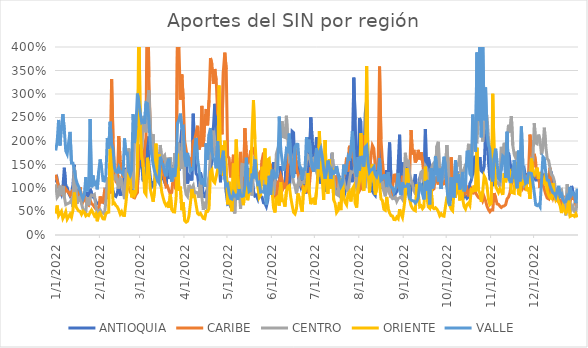
| Category | ANTIOQUIA | CARIBE | CENTRO | ORIENTE | VALLE |
|---|---|---|---|---|---|
| 1/1/22 | 1.117 | 1.285 | 1.082 | 0.455 | 1.798 |
| 1/2/22 | 1.192 | 1.158 | 0.803 | 0.627 | 1.982 |
| 1/3/22 | 1.023 | 1.024 | 0.848 | 0.408 | 2.448 |
| 1/4/22 | 0.936 | 0.945 | 1.053 | 0.456 | 1.904 |
| 1/5/22 | 0.863 | 0.889 | 0.849 | 0.505 | 2.307 |
| 1/6/22 | 1.01 | 0.976 | 1.039 | 0.351 | 2.572 |
| 1/7/22 | 1.431 | 0.874 | 0.812 | 0.409 | 2.235 |
| 1/8/22 | 1.046 | 0.979 | 0.646 | 0.493 | 1.79 |
| 1/9/22 | 1.014 | 0.939 | 0.664 | 0.336 | 1.722 |
| 1/10/22 | 0.889 | 0.909 | 0.679 | 0.39 | 1.964 |
| 1/11/22 | 0.828 | 0.85 | 0.693 | 0.445 | 2.193 |
| 1/12/22 | 0.887 | 0.909 | 0.748 | 0.377 | 1.531 |
| 1/13/22 | 1.061 | 0.841 | 0.593 | 0.521 | 1.53 |
| 1/14/22 | 1.492 | 0.789 | 1.447 | 0.903 | 1.378 |
| 1/15/22 | 0.922 | 0.735 | 1.1 | 0.612 | 1.202 |
| 1/16/22 | 0.868 | 0.699 | 0.672 | 0.556 | 1.094 |
| 1/17/22 | 0.958 | 0.734 | 0.785 | 0.511 | 1.031 |
| 1/18/22 | 0.845 | 1.02 | 0.81 | 0.502 | 0.942 |
| 1/19/22 | 0.805 | 0.789 | 0.665 | 0.441 | 0.848 |
| 1/20/22 | 0.802 | 0.719 | 0.553 | 0.508 | 0.769 |
| 1/21/22 | 0.793 | 0.817 | 0.512 | 0.485 | 0.862 |
| 1/22/22 | 0.901 | 0.718 | 0.499 | 0.407 | 1.234 |
| 1/23/22 | 0.886 | 0.656 | 0.804 | 0.433 | 0.93 |
| 1/24/22 | 0.786 | 0.635 | 0.634 | 0.416 | 1.03 |
| 1/25/22 | 0.984 | 0.742 | 0.781 | 0.478 | 2.469 |
| 1/26/22 | 0.893 | 0.666 | 0.85 | 0.531 | 1.016 |
| 1/27/22 | 0.808 | 0.643 | 0.84 | 0.474 | 1.266 |
| 1/28/22 | 0.794 | 0.592 | 0.862 | 0.409 | 1.081 |
| 1/29/22 | 0.714 | 0.556 | 0.614 | 0.449 | 1.115 |
| 1/30/22 | 0.663 | 0.572 | 0.483 | 0.292 | 0.971 |
| 1/31/22 | 0.661 | 0.528 | 0.506 | 0.444 | 1.353 |
| 2/1/22 | 0.716 | 0.821 | 0.538 | 0.476 | 1.607 |
| 2/2/22 | 0.737 | 0.698 | 0.487 | 0.405 | 1.429 |
| 2/3/22 | 0.706 | 0.697 | 0.474 | 0.344 | 1.159 |
| 2/4/22 | 0.844 | 0.921 | 0.447 | 0.34 | 1.15 |
| 2/5/22 | 0.987 | 0.862 | 0.701 | 0.451 | 1.269 |
| 2/6/22 | 0.991 | 0.764 | 1.226 | 0.482 | 2.063 |
| 2/7/22 | 1.141 | 0.968 | 1.022 | 0.487 | 1.84 |
| 2/8/22 | 1.17 | 0.885 | 1.08 | 2.15 | 2.41 |
| 2/9/22 | 1.132 | 3.317 | 1.543 | 1.607 | 1.933 |
| 2/10/22 | 0.936 | 2.051 | 1.194 | 0.667 | 1.834 |
| 2/11/22 | 0.842 | 1.395 | 1.194 | 0.681 | 1.437 |
| 2/12/22 | 0.82 | 1.136 | 1.263 | 0.627 | 1.347 |
| 2/13/22 | 0.887 | 1.101 | 1.109 | 0.597 | 1.333 |
| 2/14/22 | 1.111 | 2.107 | 0.987 | 0.531 | 1.433 |
| 2/15/22 | 0.862 | 1.571 | 1.208 | 0.445 | 1.335 |
| 2/16/22 | 0.864 | 1.37 | 1.163 | 0.497 | 1.34 |
| 2/17/22 | 0.915 | 1.222 | 0.95 | 0.418 | 1.293 |
| 2/18/22 | 1.428 | 1.377 | 0.763 | 0.417 | 2.054 |
| 2/19/22 | 1.14 | 1.198 | 1.375 | 0.689 | 1.731 |
| 2/20/22 | 1.352 | 1.054 | 1.377 | 0.995 | 1.739 |
| 2/21/22 | 1.532 | 1.016 | 1.844 | 1.328 | 1.36 |
| 2/22/22 | 1.308 | 0.922 | 1.54 | 1.179 | 1.281 |
| 2/23/22 | 1.006 | 0.865 | 1.488 | 0.799 | 1.381 |
| 2/24/22 | 0.896 | 0.805 | 0.991 | 0.947 | 2.569 |
| 2/25/22 | 0.853 | 0.791 | 2.285 | 0.849 | 1.956 |
| 2/26/22 | 0.96 | 0.855 | 2.519 | 0.917 | 2.323 |
| 2/27/22 | 1.066 | 0.901 | 2.3 | 1.433 | 3.009 |
| 2/28/22 | 1.38 | 1.923 | 3.345 | 4.696 | 2.828 |
| 3/1/22 | 1.515 | 1.605 | 2.213 | 2.29 | 2.602 |
| 3/2/22 | 1.741 | 1.79 | 1.824 | 1.668 | 2.4 |
| 3/3/22 | 1.166 | 1.455 | 2.522 | 1.498 | 2.433 |
| 3/4/22 | 1.164 | 1.835 | 2.378 | 0.91 | 2.365 |
| 3/5/22 | 1.311 | 2.073 | 2.184 | 0.862 | 2.812 |
| 3/6/22 | 2.095 | 5.801 | 2.824 | 1.644 | 2.798 |
| 3/7/22 | 1.518 | 3.355 | 3.08 | 1.416 | 2.45 |
| 3/8/22 | 1.23 | 2.271 | 2.322 | 0.978 | 1.931 |
| 3/9/22 | 1.031 | 1.823 | 1.841 | 0.843 | 1.696 |
| 3/10/22 | 1.096 | 1.861 | 2.141 | 0.709 | 1.502 |
| 3/11/22 | 1.023 | 1.517 | 1.361 | 0.952 | 1.357 |
| 3/12/22 | 1.525 | 1.32 | 1.336 | 1.944 | 1.255 |
| 3/13/22 | 1.154 | 1.289 | 1.648 | 1.176 | 1.161 |
| 3/14/22 | 1.377 | 1.298 | 1.597 | 1.72 | 1.112 |
| 3/15/22 | 1.306 | 1.116 | 1.915 | 1.166 | 1.664 |
| 3/16/22 | 1.2 | 1.46 | 1.593 | 0.914 | 1.536 |
| 3/17/22 | 1.222 | 1.617 | 1.661 | 0.79 | 1.489 |
| 3/18/22 | 1.123 | 1.176 | 1.696 | 0.686 | 1.333 |
| 3/19/22 | 1.053 | 1.026 | 1.451 | 0.629 | 1.249 |
| 3/20/22 | 1.388 | 1.042 | 1.643 | 0.667 | 1.541 |
| 3/21/22 | 1.194 | 0.948 | 1.491 | 0.576 | 1.624 |
| 3/22/22 | 1.373 | 0.871 | 1.655 | 0.873 | 1.27 |
| 3/23/22 | 1.485 | 0.906 | 1.147 | 0.541 | 1.136 |
| 3/24/22 | 1.244 | 1.245 | 1.215 | 0.494 | 1.422 |
| 3/25/22 | 1.254 | 1.063 | 1.744 | 0.49 | 1.236 |
| 3/26/22 | 1.395 | 0.972 | 1.296 | 0.776 | 1.505 |
| 3/27/22 | 1.74 | 4.322 | 1.957 | 1.728 | 2.375 |
| 3/28/22 | 1.372 | 3.986 | 1.938 | 0.941 | 2.45 |
| 3/29/22 | 1.929 | 2.88 | 1.472 | 1.029 | 2.582 |
| 3/30/22 | 2.246 | 3.417 | 1.408 | 0.528 | 2.274 |
| 3/31/22 | 1.939 | 2.891 | 2.229 | 0.694 | 2.302 |
| 4/1/22 | 1.88 | 2.001 | 1.047 | 0.305 | 1.627 |
| 4/2/22 | 1.733 | 1.815 | 0.865 | 0.272 | 1.457 |
| 4/3/22 | 1.093 | 1.585 | 0.822 | 0.292 | 1.747 |
| 4/4/22 | 1.265 | 1.647 | 1.066 | 0.401 | 1.554 |
| 4/5/22 | 1.233 | 1.618 | 0.958 | 0.669 | 1.364 |
| 4/6/22 | 1.16 | 1.452 | 0.996 | 0.979 | 1.399 |
| 4/7/22 | 2.579 | 2.001 | 1.052 | 0.819 | 1.404 |
| 4/8/22 | 1.662 | 2.033 | 0.884 | 0.826 | 1.858 |
| 4/9/22 | 1.303 | 2.178 | 0.909 | 0.636 | 2.065 |
| 4/10/22 | 1.266 | 2.325 | 0.898 | 0.463 | 1.615 |
| 4/11/22 | 1.024 | 1.819 | 0.791 | 0.433 | 1.401 |
| 4/12/22 | 1.333 | 1.914 | 1.159 | 0.46 | 1.176 |
| 4/13/22 | 1.173 | 2.748 | 0.813 | 0.408 | 1.076 |
| 4/14/22 | 0.821 | 1.882 | 0.535 | 0.354 | 1.21 |
| 4/15/22 | 0.814 | 2.393 | 0.646 | 0.345 | 1.025 |
| 4/16/22 | 0.909 | 2.682 | 0.594 | 0.501 | 1.949 |
| 4/17/22 | 0.994 | 2.334 | 1.033 | 0.499 | 1.602 |
| 4/18/22 | 1.198 | 2.871 | 1.238 | 0.559 | 2.136 |
| 4/19/22 | 1.384 | 3.765 | 1.737 | 1.344 | 2.277 |
| 4/20/22 | 1.579 | 3.639 | 2.136 | 1.388 | 1.764 |
| 4/21/22 | 2.253 | 3.218 | 2.22 | 1.148 | 1.636 |
| 4/22/22 | 2.792 | 3.533 | 1.743 | 1.111 | 1.571 |
| 4/23/22 | 2.499 | 3.292 | 1.666 | 1.246 | 1.419 |
| 4/24/22 | 1.585 | 2.586 | 1.498 | 1.394 | 1.996 |
| 4/25/22 | 1.539 | 2.471 | 2.193 | 3.183 | 1.479 |
| 4/26/22 | 1.122 | 2.632 | 1.747 | 1.304 | 1.292 |
| 4/27/22 | 1.686 | 2.144 | 1.682 | 1.907 | 1.604 |
| 4/28/22 | 1.359 | 3.487 | 1.832 | 1.267 | 1.793 |
| 4/29/22 | 1.699 | 3.878 | 1.627 | 2.006 | 1.184 |
| 4/30/22 | 0.909 | 3.529 | 1.34 | 1.371 | 1.05 |
| 5/1/22 | 0.661 | 1.679 | 0.957 | 0.651 | 1.078 |
| 5/2/22 | 0.683 | 1.636 | 0.786 | 1.134 | 0.886 |
| 5/3/22 | 0.603 | 1.226 | 0.681 | 0.663 | 0.779 |
| 5/4/22 | 0.563 | 1.428 | 0.594 | 0.504 | 0.764 |
| 5/5/22 | 0.813 | 1.709 | 0.626 | 1.519 | 0.888 |
| 5/6/22 | 0.872 | 1.39 | 0.459 | 0.885 | 0.83 |
| 5/7/22 | 1.434 | 1.254 | 1.152 | 2.03 | 0.845 |
| 5/8/22 | 1.149 | 1.049 | 1.131 | 1.274 | 0.745 |
| 5/9/22 | 0.983 | 1.344 | 0.967 | 0.997 | 0.976 |
| 5/10/22 | 1.09 | 1.767 | 0.554 | 0.82 | 0.839 |
| 5/11/22 | 1.02 | 1.114 | 1.502 | 0.904 | 0.82 |
| 5/12/22 | 0.964 | 0.957 | 1.495 | 0.636 | 0.832 |
| 5/13/22 | 0.867 | 2.272 | 1.245 | 0.947 | 1.038 |
| 5/14/22 | 1.212 | 1.766 | 1.523 | 0.985 | 1.644 |
| 5/15/22 | 0.961 | 1.517 | 1.049 | 0.739 | 1.201 |
| 5/16/22 | 1.423 | 1.593 | 1.035 | 0.946 | 0.922 |
| 5/17/22 | 0.934 | 1.782 | 1.422 | 1.201 | 0.943 |
| 5/18/22 | 1.208 | 1.803 | 0.84 | 2.149 | 1.308 |
| 5/19/22 | 0.936 | 1.832 | 1.382 | 2.873 | 1.204 |
| 5/20/22 | 0.831 | 1.691 | 1.679 | 2.042 | 1.604 |
| 5/21/22 | 0.848 | 1.382 | 1.347 | 1.476 | 1.232 |
| 5/22/22 | 0.77 | 1.229 | 1.045 | 1.053 | 1.085 |
| 5/23/22 | 0.937 | 1.292 | 0.976 | 0.799 | 1.116 |
| 5/24/22 | 0.82 | 1.127 | 1.051 | 0.851 | 0.913 |
| 5/25/22 | 0.806 | 1.587 | 1.178 | 1.452 | 0.919 |
| 5/26/22 | 0.686 | 1.751 | 1.046 | 1.18 | 0.911 |
| 5/27/22 | 0.674 | 1.506 | 1.414 | 1.841 | 1.068 |
| 5/28/22 | 0.604 | 1.559 | 1.085 | 1.024 | 0.646 |
| 5/29/22 | 0.736 | 1.575 | 0.944 | 1.603 | 0.886 |
| 5/30/22 | 1.114 | 1.376 | 0.921 | 1.627 | 1.26 |
| 5/31/22 | 1.027 | 1.433 | 0.917 | 1.194 | 0.859 |
| 6/1/22 | 1.03 | 1.043 | 1.002 | 0.935 | 1.366 |
| 6/2/22 | 1.553 | 1.032 | 0.847 | 0.58 | 1.366 |
| 6/3/22 | 1.268 | 0.857 | 1.142 | 0.48 | 1.215 |
| 6/4/22 | 0.958 | 0.744 | 1.727 | 0.787 | 1.225 |
| 6/5/22 | 1.008 | 1.129 | 1.836 | 0.815 | 1.453 |
| 6/6/22 | 1.144 | 1.141 | 1.738 | 0.626 | 2.519 |
| 6/7/22 | 1.468 | 1.268 | 2.26 | 1.121 | 1.836 |
| 6/8/22 | 1.008 | 1.171 | 2.42 | 0.726 | 1.59 |
| 6/9/22 | 1.009 | 1.006 | 2.088 | 0.724 | 1.361 |
| 6/10/22 | 1.039 | 1.067 | 2.075 | 0.604 | 1.537 |
| 6/11/22 | 1.732 | 1.008 | 2.538 | 0.933 | 1.828 |
| 6/12/22 | 1.222 | 1.467 | 2.024 | 1.024 | 1.794 |
| 6/13/22 | 0.957 | 1.86 | 1.606 | 1.049 | 2.158 |
| 6/14/22 | 1.498 | 1.618 | 1.654 | 0.806 | 1.68 |
| 6/15/22 | 2.204 | 1.521 | 1.29 | 0.634 | 1.293 |
| 6/16/22 | 2.176 | 1.577 | 1.115 | 0.482 | 1.216 |
| 6/17/22 | 1.303 | 1.838 | 1.037 | 0.449 | 1.875 |
| 6/18/22 | 1.434 | 1.419 | 0.878 | 0.559 | 1.93 |
| 6/19/22 | 1.579 | 1.312 | 1.082 | 0.882 | 1.928 |
| 6/20/22 | 1.127 | 1.188 | 1.183 | 0.795 | 1.497 |
| 6/21/22 | 1.026 | 1.06 | 1.075 | 0.62 | 1.428 |
| 6/22/22 | 1.155 | 1.012 | 1.116 | 0.493 | 1.178 |
| 6/23/22 | 1.155 | 0.946 | 1.114 | 0.993 | 1.403 |
| 6/24/22 | 0.878 | 1.064 | 1.305 | 0.942 | 1.397 |
| 6/25/22 | 1.104 | 0.951 | 1.59 | 1.032 | 2.083 |
| 6/26/22 | 2.074 | 0.919 | 1.692 | 1.315 | 1.759 |
| 6/27/22 | 1.332 | 1.05 | 1.658 | 0.914 | 2.027 |
| 6/28/22 | 2.501 | 1.407 | 1.527 | 0.655 | 1.684 |
| 6/29/22 | 2.024 | 1.396 | 1.608 | 0.76 | 1.426 |
| 6/30/22 | 1.66 | 1.52 | 1.632 | 0.77 | 1.346 |
| 7/1/22 | 1.686 | 1.372 | 1.495 | 0.646 | 1.549 |
| 7/2/22 | 2.084 | 1.777 | 1.341 | 0.929 | 1.851 |
| 7/3/22 | 1.169 | 1.271 | 1.238 | 1.274 | 1.402 |
| 7/4/22 | 1.4 | 1.936 | 1.801 | 2.211 | 1.762 |
| 7/5/22 | 1.094 | 1.583 | 1.856 | 1.387 | 1.84 |
| 7/6/22 | 1.199 | 1.333 | 1.516 | 1.18 | 1.674 |
| 7/7/22 | 1.081 | 1.219 | 1.595 | 0.747 | 1.401 |
| 7/8/22 | 1.279 | 1.317 | 1.167 | 2.02 | 1.198 |
| 7/9/22 | 0.916 | 1.4 | 1.443 | 1.119 | 1.381 |
| 7/10/22 | 1.079 | 1.358 | 1.248 | 0.877 | 1.585 |
| 7/11/22 | 1.52 | 1.236 | 1.129 | 1.612 | 1.422 |
| 7/12/22 | 1.032 | 1.513 | 1.236 | 0.99 | 1.193 |
| 7/13/22 | 1.735 | 1.446 | 1.753 | 1.422 | 1.372 |
| 7/14/22 | 1.089 | 1.248 | 1.218 | 0.746 | 1.314 |
| 7/15/22 | 0.894 | 1.242 | 0.958 | 0.672 | 1.331 |
| 7/16/22 | 0.989 | 1.009 | 0.863 | 0.476 | 1.468 |
| 7/17/22 | 1.298 | 1.214 | 0.845 | 0.521 | 1.299 |
| 7/18/22 | 1.237 | 1.148 | 1.238 | 0.703 | 1.148 |
| 7/19/22 | 0.803 | 0.969 | 0.826 | 0.53 | 1.034 |
| 7/20/22 | 0.763 | 1.08 | 1.128 | 1.211 | 1.093 |
| 7/21/22 | 0.8 | 1.226 | 1.18 | 0.812 | 1.499 |
| 7/22/22 | 0.925 | 1.403 | 1.033 | 0.694 | 1.293 |
| 7/23/22 | 1.398 | 1.646 | 0.996 | 0.642 | 1.448 |
| 7/24/22 | 0.995 | 1.353 | 0.92 | 0.874 | 1.655 |
| 7/25/22 | 1.382 | 1.897 | 1.17 | 0.92 | 1.581 |
| 7/26/22 | 1.574 | 1.641 | 1.349 | 0.713 | 1.834 |
| 7/27/22 | 1.125 | 1.813 | 1.334 | 0.976 | 2.205 |
| 7/28/22 | 3.347 | 1.622 | 1.348 | 1.036 | 1.776 |
| 7/29/22 | 2.449 | 1.265 | 1.454 | 0.674 | 1.382 |
| 7/30/22 | 1.188 | 1.048 | 0.994 | 0.584 | 1.242 |
| 7/31/22 | 1.15 | 1.049 | 1.024 | 0.997 | 1.655 |
| 8/1/22 | 2.49 | 0.942 | 1.274 | 1.141 | 1.372 |
| 8/2/22 | 2.398 | 0.991 | 1.313 | 2.167 | 1.681 |
| 8/3/22 | 1.447 | 1.463 | 1.209 | 1.237 | 1.601 |
| 8/4/22 | 1.489 | 2.127 | 1.066 | 0.936 | 1.455 |
| 8/5/22 | 2.584 | 1.535 | 1.004 | 1.398 | 1.872 |
| 8/6/22 | 2.872 | 1.447 | 1.797 | 3.597 | 1.902 |
| 8/7/22 | 1.359 | 1.462 | 1.406 | 1.313 | 1.544 |
| 8/8/22 | 1.104 | 1.38 | 1.203 | 0.904 | 1.336 |
| 8/9/22 | 1.173 | 1.676 | 1.13 | 1.41 | 1.383 |
| 8/10/22 | 0.933 | 1.906 | 1.444 | 1.502 | 1.395 |
| 8/11/22 | 0.882 | 1.844 | 1.512 | 1.17 | 1.442 |
| 8/12/22 | 0.844 | 1.463 | 0.988 | 0.858 | 1.289 |
| 8/13/22 | 1.133 | 1.412 | 1.034 | 0.978 | 1.243 |
| 8/14/22 | 1.594 | 1.409 | 1.132 | 1.351 | 1.349 |
| 8/15/22 | 1.936 | 3.583 | 1.135 | 1.074 | 1.633 |
| 8/16/22 | 1.867 | 2.042 | 1.052 | 0.769 | 1.163 |
| 8/17/22 | 1.002 | 1.569 | 1.148 | 0.734 | 1.194 |
| 8/18/22 | 0.974 | 1.252 | 0.934 | 0.549 | 1.264 |
| 8/19/22 | 0.888 | 1.039 | 0.822 | 0.527 | 1.265 |
| 8/20/22 | 1.38 | 0.949 | 0.997 | 0.81 | 1.02 |
| 8/21/22 | 1.106 | 0.988 | 1.169 | 0.561 | 1.335 |
| 8/22/22 | 1.966 | 0.898 | 0.89 | 0.469 | 1.101 |
| 8/23/22 | 1.164 | 0.8 | 0.817 | 0.412 | 1.032 |
| 8/24/22 | 0.846 | 0.982 | 0.776 | 0.405 | 1.006 |
| 8/25/22 | 0.8 | 1.273 | 0.792 | 0.33 | 0.902 |
| 8/26/22 | 0.872 | 1.278 | 0.811 | 0.326 | 0.974 |
| 8/27/22 | 0.927 | 1.047 | 0.715 | 0.381 | 1.064 |
| 8/28/22 | 1.515 | 1.019 | 0.778 | 0.346 | 1.32 |
| 8/29/22 | 2.134 | 1.006 | 0.792 | 0.549 | 0.944 |
| 8/30/22 | 0.9 | 0.987 | 0.811 | 0.442 | 0.848 |
| 8/31/22 | 1.544 | 1.261 | 0.759 | 0.371 | 1.124 |
| 9/1/22 | 1.086 | 1.012 | 1.123 | 0.575 | 1.029 |
| 9/2/22 | 0.91 | 0.942 | 1.749 | 0.825 | 1.039 |
| 9/3/22 | 1.57 | 1.257 | 1.457 | 1.421 | 1.038 |
| 9/4/22 | 0.93 | 1.3 | 1.599 | 1.243 | 1.107 |
| 9/5/22 | 0.747 | 1.255 | 1.306 | 0.764 | 0.782 |
| 9/6/22 | 1.006 | 2.233 | 1.175 | 0.626 | 0.745 |
| 9/7/22 | 1.158 | 1.714 | 1.092 | 0.567 | 0.727 |
| 9/8/22 | 1.024 | 1.811 | 0.949 | 0.532 | 0.725 |
| 9/9/22 | 1.289 | 1.543 | 0.878 | 0.517 | 0.68 |
| 9/10/22 | 0.811 | 1.622 | 0.865 | 1.08 | 0.718 |
| 9/11/22 | 0.762 | 1.811 | 1.108 | 0.899 | 0.783 |
| 9/12/22 | 1.208 | 1.607 | 1.126 | 0.601 | 1.091 |
| 9/13/22 | 1.312 | 1.761 | 1.339 | 0.623 | 1.072 |
| 9/14/22 | 1.358 | 1.553 | 1.361 | 0.56 | 0.87 |
| 9/15/22 | 0.924 | 1.303 | 1.118 | 0.6 | 0.757 |
| 9/16/22 | 2.254 | 1.421 | 1.467 | 1.454 | 1.15 |
| 9/17/22 | 1.038 | 1.269 | 1.415 | 0.825 | 0.939 |
| 9/18/22 | 1.653 | 1.291 | 1.204 | 0.602 | 1.172 |
| 9/19/22 | 1.491 | 1.261 | 1.105 | 0.571 | 0.652 |
| 9/20/22 | 1.178 | 1.024 | 1.39 | 0.991 | 1.42 |
| 9/21/22 | 1.278 | 0.96 | 1.496 | 0.583 | 0.99 |
| 9/22/22 | 1.5 | 0.985 | 1.535 | 0.559 | 1.121 |
| 9/23/22 | 1.402 | 1.242 | 1.347 | 0.581 | 1.679 |
| 9/24/22 | 1.634 | 1.153 | 1.894 | 0.551 | 1.41 |
| 9/25/22 | 1.566 | 1.074 | 1.984 | 0.497 | 1.139 |
| 9/26/22 | 1.289 | 1.456 | 1.256 | 0.41 | 1.412 |
| 9/27/22 | 1.045 | 0.991 | 1.315 | 0.453 | 0.978 |
| 9/28/22 | 1.244 | 1.249 | 1.166 | 0.408 | 1.428 |
| 9/29/22 | 1.242 | 1.091 | 1.495 | 0.4 | 1.666 |
| 9/30/22 | 1.379 | 1.102 | 1.424 | 0.606 | 1.462 |
| 10/1/22 | 1.125 | 1.045 | 1.912 | 0.804 | 1.02 |
| 10/2/22 | 0.794 | 1.039 | 1.445 | 0.857 | 0.699 |
| 10/3/22 | 0.748 | 0.864 | 0.903 | 0.639 | 0.621 |
| 10/4/22 | 0.758 | 1.652 | 0.932 | 0.548 | 1.229 |
| 10/5/22 | 0.942 | 1.065 | 0.822 | 0.515 | 0.953 |
| 10/6/22 | 0.955 | 0.871 | 0.992 | 0.947 | 0.794 |
| 10/7/22 | 1.023 | 1.348 | 1.14 | 0.794 | 1.592 |
| 10/8/22 | 1.356 | 0.971 | 1.456 | 1.304 | 1.116 |
| 10/9/22 | 1.059 | 0.896 | 1.5 | 1.034 | 1.289 |
| 10/10/22 | 0.94 | 0.848 | 1.695 | 0.734 | 0.968 |
| 10/11/22 | 0.892 | 0.774 | 1.194 | 1.127 | 1.091 |
| 10/12/22 | 0.753 | 1.151 | 1.254 | 0.769 | 1.342 |
| 10/13/22 | 0.887 | 1.14 | 1.407 | 0.607 | 0.93 |
| 10/14/22 | 0.833 | 0.909 | 1.492 | 0.554 | 1.003 |
| 10/15/22 | 0.782 | 0.975 | 1.552 | 0.647 | 1.767 |
| 10/16/22 | 0.814 | 0.821 | 1.913 | 0.68 | 1.774 |
| 10/17/22 | 1.092 | 0.947 | 1.911 | 0.626 | 1.302 |
| 10/18/22 | 1.16 | 0.986 | 1.552 | 0.961 | 1.254 |
| 10/19/22 | 1.302 | 0.867 | 1.937 | 0.94 | 2.563 |
| 10/20/22 | 1.684 | 1.002 | 2.272 | 1.053 | 2.171 |
| 10/21/22 | 1.346 | 0.897 | 1.992 | 0.926 | 1.774 |
| 10/22/22 | 1.216 | 0.846 | 1.983 | 1.857 | 3.884 |
| 10/23/22 | 1.537 | 0.799 | 2.528 | 0.96 | 2.432 |
| 10/24/22 | 1.659 | 0.781 | 2.453 | 0.885 | 4.04 |
| 10/25/22 | 1.366 | 0.813 | 2.378 | 0.709 | 2.079 |
| 10/26/22 | 1.334 | 0.727 | 1.987 | 0.924 | 4.212 |
| 10/27/22 | 1.451 | 0.811 | 2.351 | 1.255 | 2.442 |
| 10/28/22 | 2.194 | 0.726 | 2.553 | 1.195 | 3.139 |
| 10/29/22 | 2.157 | 0.614 | 2.536 | 1.037 | 2.152 |
| 10/30/22 | 1.559 | 0.542 | 2.077 | 0.763 | 1.909 |
| 10/31/22 | 1.19 | 0.495 | 1.819 | 0.644 | 1.834 |
| 11/1/22 | 1.168 | 0.536 | 1.521 | 0.672 | 1.26 |
| 11/2/22 | 1.065 | 0.533 | 1.416 | 3.005 | 1.139 |
| 11/3/22 | 1.112 | 0.89 | 1.513 | 1.679 | 1.648 |
| 11/4/22 | 1.208 | 0.791 | 1.16 | 1.047 | 1.836 |
| 11/5/22 | 1.229 | 0.663 | 1.135 | 0.971 | 1.546 |
| 11/6/22 | 1.346 | 0.653 | 1.09 | 0.904 | 1.199 |
| 11/7/22 | 1.264 | 0.615 | 1.031 | 0.983 | 1.171 |
| 11/8/22 | 1.416 | 0.585 | 1.875 | 0.925 | 1.457 |
| 11/9/22 | 1.708 | 0.61 | 1.603 | 0.853 | 1.68 |
| 11/10/22 | 1.867 | 0.62 | 1.96 | 1.316 | 1.649 |
| 11/11/22 | 1.482 | 0.644 | 1.894 | 1.121 | 1.219 |
| 11/12/22 | 1.489 | 0.768 | 2.047 | 1.268 | 2.197 |
| 11/13/22 | 1.753 | 0.807 | 2.345 | 1.289 | 1.231 |
| 11/14/22 | 1.542 | 0.896 | 2.182 | 1.332 | 1.135 |
| 11/15/22 | 1.41 | 1.087 | 2.527 | 0.904 | 1.135 |
| 11/16/22 | 1.364 | 1.149 | 1.909 | 0.899 | 1.333 |
| 11/17/22 | 1.164 | 1.166 | 1.711 | 0.888 | 1.596 |
| 11/18/22 | 1.357 | 1.136 | 1.639 | 1.547 | 1.195 |
| 11/19/22 | 1.278 | 1.021 | 1.776 | 1.249 | 0.995 |
| 11/20/22 | 1.224 | 1.633 | 1.615 | 0.878 | 1.796 |
| 11/21/22 | 1.182 | 1.145 | 1.573 | 0.858 | 1.142 |
| 11/22/22 | 1.145 | 1.191 | 1.437 | 1.185 | 2.307 |
| 11/23/22 | 1.346 | 0.996 | 1.287 | 1.084 | 1.512 |
| 11/24/22 | 1.401 | 1.048 | 1.051 | 1.096 | 1.289 |
| 11/25/22 | 1.211 | 0.953 | 1.085 | 1.171 | 1.097 |
| 11/26/22 | 1.308 | 1.242 | 1.191 | 0.933 | 1.122 |
| 11/27/22 | 1.089 | 1.311 | 1.139 | 1.014 | 1.314 |
| 11/28/22 | 1.48 | 2.136 | 1.354 | 0.769 | 1.319 |
| 11/29/22 | 1.397 | 1.737 | 1.62 | 1.625 | 1.308 |
| 11/30/22 | 1.368 | 1.441 | 1.606 | 1.357 | 1.12 |
| 12/1/22 | 1.232 | 1.727 | 2.378 | 1.287 | 0.893 |
| 12/2/22 | 1.169 | 1.545 | 1.957 | 1.344 | 0.641 |
| 12/3/22 | 1.172 | 1.195 | 1.939 | 1.431 | 0.625 |
| 12/4/22 | 1.212 | 1.278 | 2.136 | 1.2 | 0.653 |
| 12/5/22 | 1.196 | 1 | 2.019 | 1.298 | 0.601 |
| 12/6/22 | 1.221 | 1.344 | 1.709 | 1.286 | 1.147 |
| 12/7/22 | 1.169 | 1.07 | 1.867 | 1.139 | 1.665 |
| 12/8/22 | 1.27 | 0.974 | 2.283 | 1.102 | 1.63 |
| 12/9/22 | 1.239 | 0.865 | 1.898 | 1.319 | 1.325 |
| 12/10/22 | 1.1 | 0.786 | 1.627 | 0.945 | 1.168 |
| 12/11/22 | 1.122 | 0.768 | 1.585 | 0.844 | 1.162 |
| 12/12/22 | 1.388 | 1.431 | 1.424 | 0.792 | 1.048 |
| 12/13/22 | 1.312 | 0.89 | 1.283 | 0.775 | 0.965 |
| 12/14/22 | 1.152 | 0.789 | 1.248 | 1.102 | 0.899 |
| 12/15/22 | 0.984 | 0.884 | 1.151 | 0.851 | 0.883 |
| 12/16/22 | 0.899 | 0.76 | 0.899 | 0.742 | 0.816 |
| 12/17/22 | 0.821 | 0.732 | 0.862 | 0.792 | 0.948 |
| 12/18/22 | 0.87 | 0.791 | 0.861 | 0.703 | 1.047 |
| 12/19/22 | 0.836 | 0.708 | 0.934 | 0.626 | 0.832 |
| 12/20/22 | 0.806 | 0.658 | 0.96 | 0.466 | 0.87 |
| 12/21/22 | 0.772 | 0.836 | 0.779 | 0.614 | 0.746 |
| 12/22/22 | 0.791 | 0.653 | 0.784 | 0.529 | 0.7 |
| 12/23/22 | 0.794 | 0.588 | 0.418 | 0.467 | 0.712 |
| 12/24/22 | 0.834 | 0.586 | 1.08 | 0.511 | 0.817 |
| 12/25/22 | 0.772 | 0.558 | 0.616 | 0.773 | 0.742 |
| 12/26/22 | 0.813 | 0.693 | 0.683 | 0.395 | 1.023 |
| 12/27/22 | 1.045 | 0.851 | 0.546 | 0.412 | 0.85 |
| 12/28/22 | 0.913 | 0.777 | 0.614 | 0.42 | 0.894 |
| 12/29/22 | 0.852 | 0.77 | 0.501 | 0.396 | 0.86 |
| 12/30/22 | 0.774 | 0.635 | 0.496 | 0.451 | 0.678 |
| 12/31/22 | 0.762 | 0.615 | 0.716 | 0.376 | 0.984 |